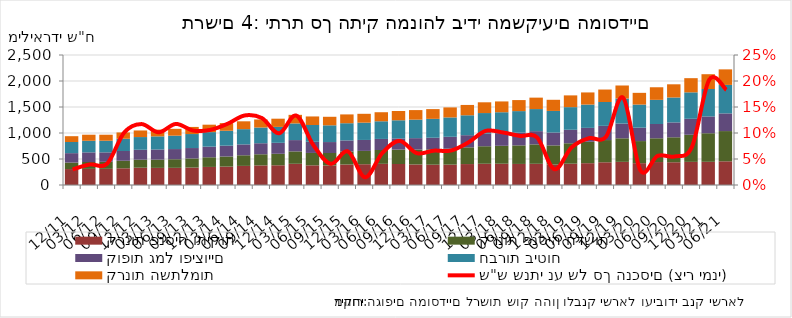
| Category | קרנות פנסיה ותיקות | קרנות פנסיה חדשות | קופות גמל ופיצויים | חברות ביטוח | קרנות השתלמות |
|---|---|---|---|---|---|
| 2011-12-31 | 306732.787 | 124427.379 | 181513.267 | 213753.677 | 112322.07 |
| 2012-03-31 | 309962.474 | 132054.759 | 185709.524 | 222700.196 | 116565.914 |
| 2012-06-30 | 310726.914 | 135214.076 | 181915.65 | 223429.179 | 115477.611 |
| 2012-09-30 | 321359.41 | 144631.964 | 188240.895 | 234952.142 | 121690.526 |
| 2012-12-31 | 332917.727 | 153936.538 | 190777.335 | 244320.995 | 126816.062 |
| 2013-03-31 | 329239.934 | 158909 | 194876.963 | 252004.742 | 129900.283 |
| 2013-06-30 | 330013.726 | 165382.763 | 195668.633 | 257849.027 | 131391.464 |
| 2013-09-30 | 335261.122 | 175280.479 | 200367.046 | 269033.009 | 136805.284 |
| 2013-12-31 | 347555.451 | 185635.527 | 204663.016 | 279142.361 | 142912.911 |
| 2014-03-31 | 353841.237 | 194503.566 | 207855.448 | 286937.671 | 147050.79 |
| 2014-06-30 | 367347.109 | 204231.289 | 209018.825 | 293685.099 | 150456.911 |
| 2014-09-30 | 376835.81 | 214231.406 | 212122.612 | 302166.651 | 155186.364 |
| 2014-12-31 | 379149.747 | 220941.602 | 211145.904 | 306088.457 | 157811.406 |
| 2015-03-31 | 407766.852 | 238480.103 | 217541.262 | 320021.053 | 165379.123 |
| 2015-06-30 | 377998.91 | 238584.047 | 213964.644 | 323046.986 | 164673.63 |
| 2015-09-30 | 375003.671 | 240239.995 | 210631.449 | 321958.368 | 164024.895 |
| 2015-12-31 | 394009.261 | 250710.3 | 212571.186 | 330789.846 | 169409.673 |
| 2016-03-31 | 399560.392 | 256138.452 | 210717.212 | 332791.969 | 169965.765 |
| 2016-06-30 | 407029.119 | 266330.142 | 212719.128 | 339548.345 | 173857.09 |
| 2016-09-30 | 404282.94 | 276548.745 | 215975.352 | 347964.478 | 178395.11 |
| 2016-12-31 | 395218.356 | 286472.786 | 219236.832 | 355928.441 | 183799.701 |
| 2017-03-31 | 390378.339 | 295724.533 | 222912.57 | 363011.334 | 187566.428 |
| 2017-06-30 | 391709.081 | 307141.439 | 228329.728 | 372231.012 | 192874.939 |
| 2017-09-30 | 402740.093 | 321661.487 | 233741.441 | 382646.482 | 198731.491 |
| 2017-12-31 | 408397.183 | 337110.231 | 241863.688 | 396293.151 | 206768.207 |
| 2018-03-31 | 408963.351 | 344950.856 | 243400.808 | 402045.85 | 207767.029 |
| 2018-06-30 | 404980.359 | 356723.509 | 247271.377 | 412065.083 | 212149.531 |
| 2018-09-30 | 407549.506 | 373583.03 | 254365.581 | 424811.464 | 219817.214 |
| 2018-12-31 | 392610.35 | 369066.721 | 247165.547 | 415663.942 | 214152.19 |
| 2019-03-31 | 409682.434 | 392949.873 | 259599.347 | 435130.795 | 225972.39 |
| 2019-06-30 | 419699.746 | 412238.813 | 266829.127 | 448024.74 | 233337.284 |
| 2019-09-30 | 436873.365 | 427408.051 | 273305.515 | 458457.617 | 239774.326 |
| 2019-12-31 | 445070.178 | 453159.976 | 283994.45 | 481206.961 | 250173.86 |
| 2020-03-31 | 420264.639 | 424460.557 | 257990.521 | 443809.629 | 225647.442 |
| 2020-06-30 | 441583.014 | 456963.565 | 274382.869 | 464715.564 | 242032.798 |
| 2020-09-30 | 437471.661 | 480207.453 | 285869.533 | 479529.895 | 253459.669 |
| 2020-12-31 | 444730.312 | 521341.893 | 307058.721 | 508635.702 | 272631.199 |
| 2021-03-31 | 445846.383 | 549551.75 | 323387.197 | 527059.137 | 284834.843 |
| 2021-06-30 | 455642.782 | 581354.211 | 340022.339 | 547917.213 | 298732.086 |